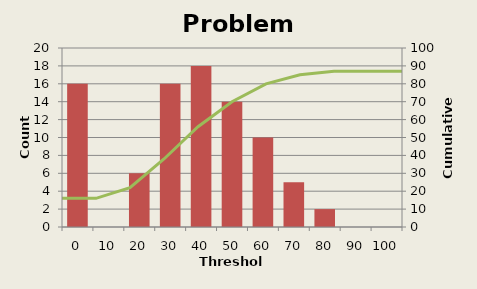
| Category | Count |
|---|---|
| 0.0 | 16 |
| 10.0 | 0 |
| 20.0 | 6 |
| 30.0 | 16 |
| 40.0 | 18 |
| 50.0 | 14 |
| 60.0 | 10 |
| 70.0 | 5 |
| 80.0 | 2 |
| 90.0 | 0 |
| 100.0 | 0 |